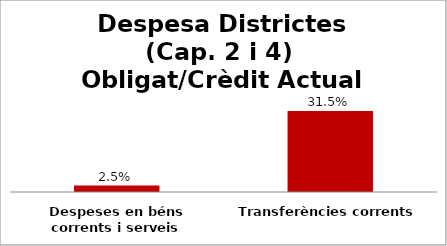
| Category | Series 0 |
|---|---|
| Despeses en béns corrents i serveis | 0.025 |
| Transferències corrents | 0.315 |